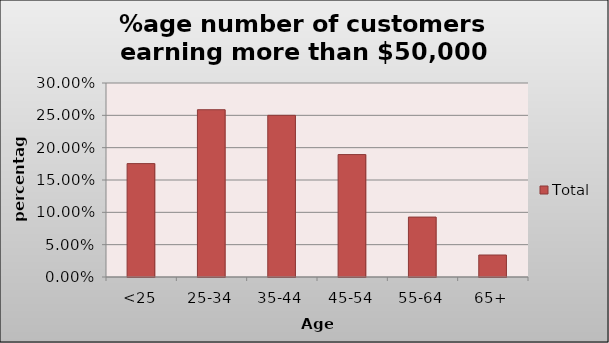
| Category | Total |
|---|---|
| <25 | 0.175 |
| 25-34 | 0.259 |
| 35-44 | 0.25 |
| 45-54 | 0.189 |
| 55-64 | 0.093 |
| 65+ | 0.034 |